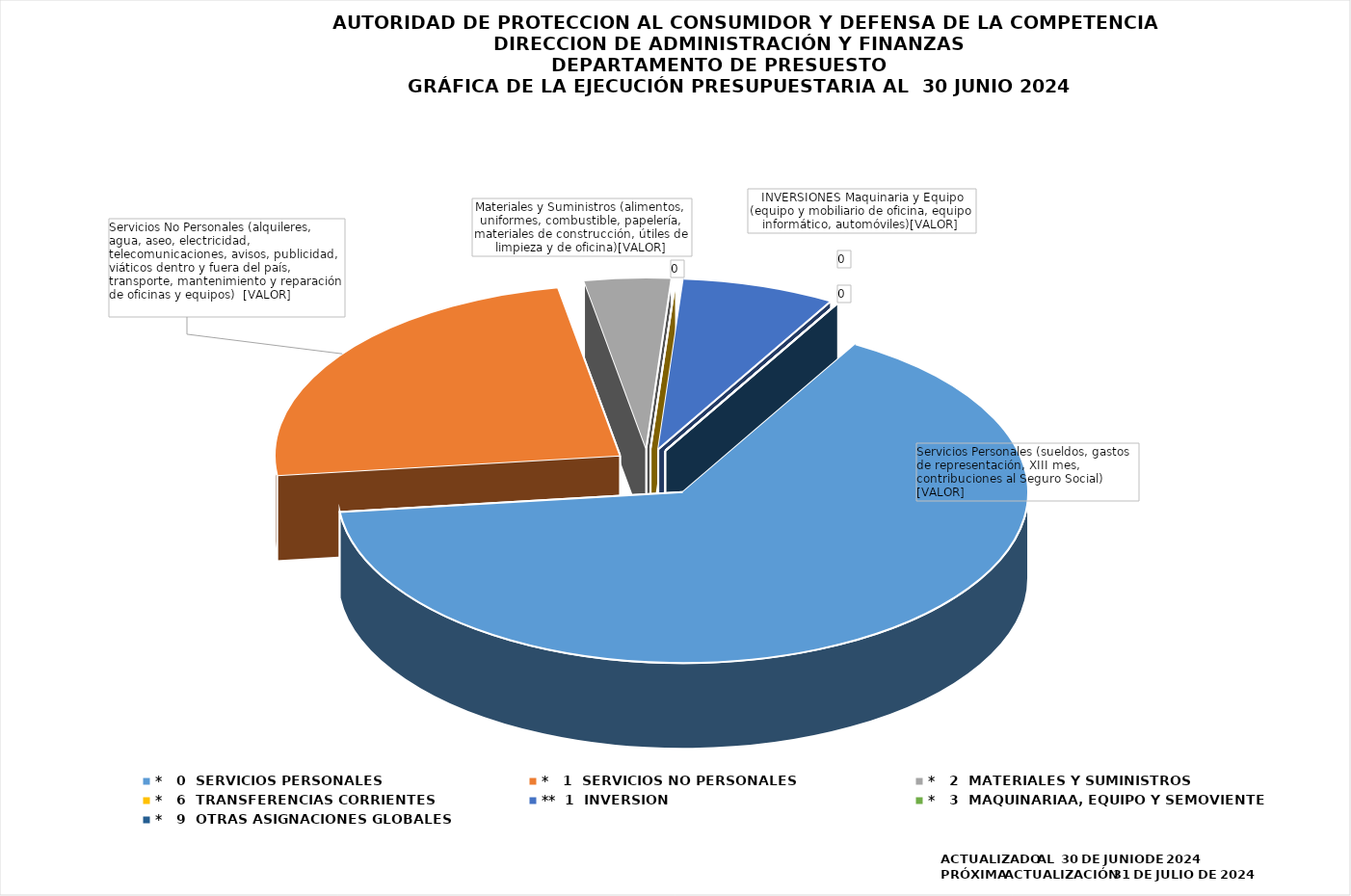
| Category | Series 0 |
|---|---|
| *   0  SERVICIOS PERSONALES | 364571.35 |
| *   1  SERVICIOS NO PERSONALES | 134849.01 |
| *   2  MATERIALES Y SUMINISTROS | 22796.2 |
| *   6  TRANSFERENCIAS CORRIENTES | 0 |
| **  1  INVERSIÓN | 40278.1 |
| *   3  MAQUINARIAA, EQUIPO Y SEMOVIENTE | 0 |
| *   9  OTRAS ASIGNACIONES GLOBALES | 0 |